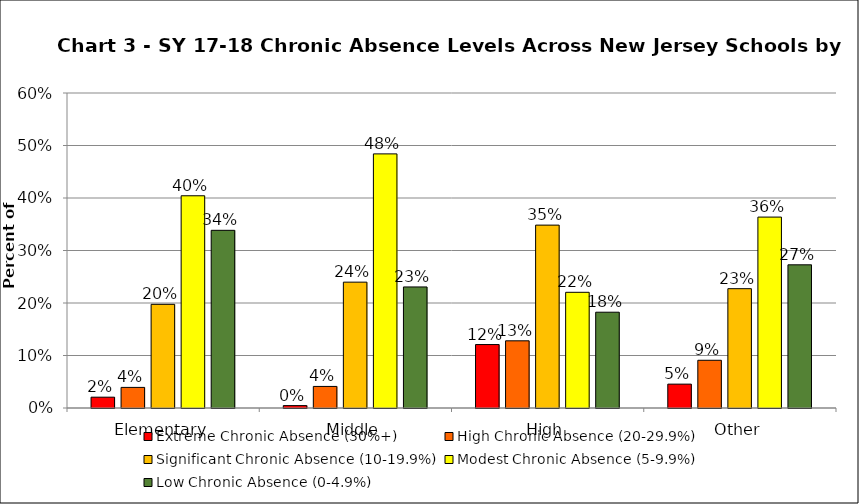
| Category | Extreme Chronic Absence (30%+) | High Chronic Absence (20-29.9%) | Significant Chronic Absence (10-19.9%) | Modest Chronic Absence (5-9.9%) | Low Chronic Absence (0-4.9%) |
|---|---|---|---|---|---|
| 0 | 0.021 | 0.039 | 0.197 | 0.404 | 0.338 |
| 1 | 0.005 | 0.041 | 0.24 | 0.484 | 0.231 |
| 2 | 0.121 | 0.128 | 0.348 | 0.22 | 0.182 |
| 3 | 0.045 | 0.091 | 0.227 | 0.364 | 0.273 |